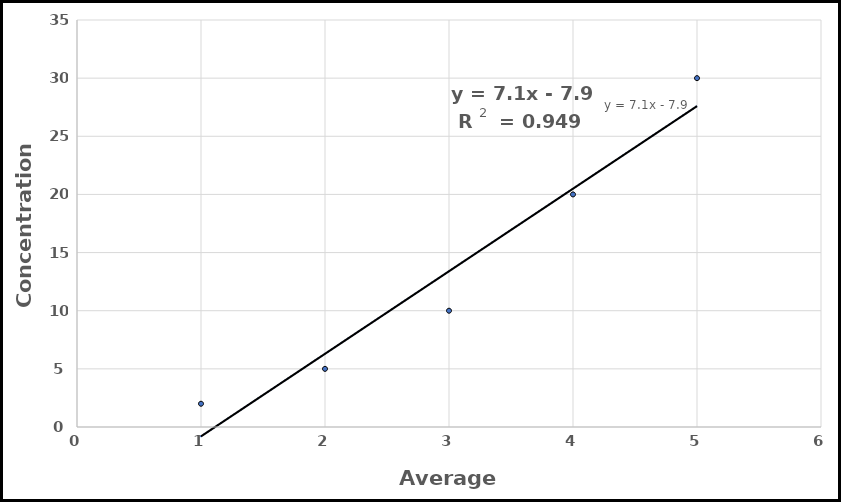
| Category | Series 0 |
|---|---|
| 0.0 | 2 |
| 0.0 | 5 |
| 0.0 | 10 |
| 0.0 | 20 |
| 0.0 | 30 |